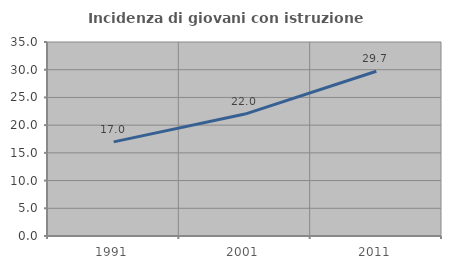
| Category | Incidenza di giovani con istruzione universitaria |
|---|---|
| 1991.0 | 16.986 |
| 2001.0 | 21.998 |
| 2011.0 | 29.728 |